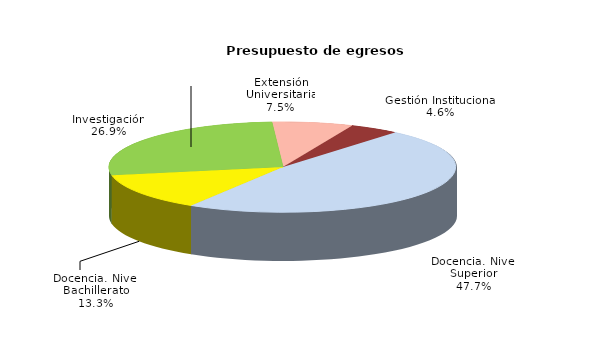
| Category | Series 0 |
|---|---|
| Docencia. Nivel Superior | 23295231499 |
| Docencia. Nivel Bachillerato | 6479673142 |
| Investigación | 13105333751 |
| Extensión Universitaria | 3666528943 |
| Gestión Institucional | 2255602530 |